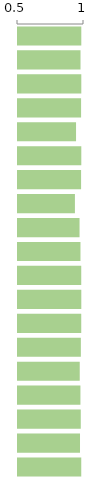
| Category | Score |
|---|---|
| 0 | 0.98 |
| 1 | 0.974 |
| 2 | 0.98 |
| 3 | 0.978 |
| 4 | 0.94 |
| 5 | 0.98 |
| 6 | 0.978 |
| 7 | 0.931 |
| 8 | 0.966 |
| 9 | 0.973 |
| 10 | 0.979 |
| 11 | 0.98 |
| 12 | 0.979 |
| 13 | 0.976 |
| 14 | 0.968 |
| 15 | 0.973 |
| 16 | 0.976 |
| 17 | 0.97 |
| 18 | 0.979 |